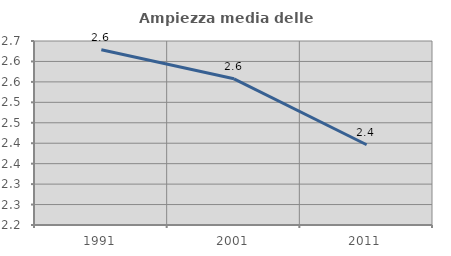
| Category | Ampiezza media delle famiglie |
|---|---|
| 1991.0 | 2.628 |
| 2001.0 | 2.558 |
| 2011.0 | 2.396 |